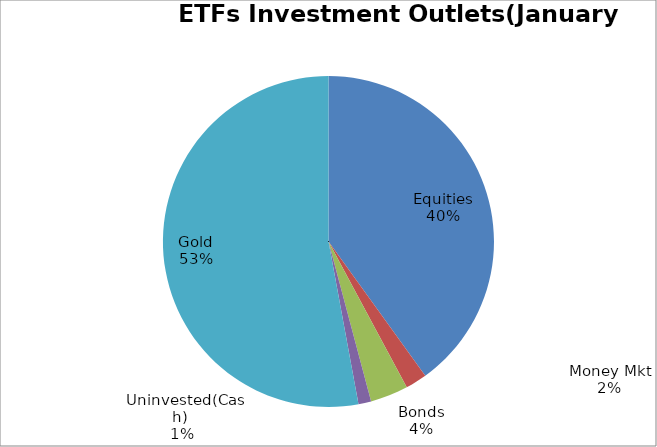
| Category | Series 0 |
|---|---|
| Equities | 6261034928.78 |
| Money Mkt | 328719643.75 |
| Bonds | 576943023.25 |
| Uninvested(Cash) | 194194454.34 |
| Gold | 8268148641.96 |